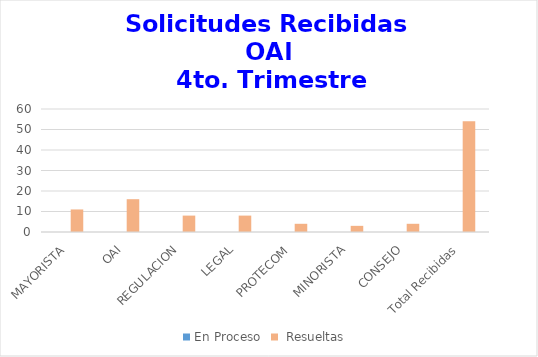
| Category | En Proceso |  Resueltas  |
|---|---|---|
| MAYORISTA | 0 | 11 |
| OAI | 0 | 16 |
| REGULACION | 0 | 8 |
| LEGAL | 0 | 8 |
| PROTECOM | 0 | 4 |
| MINORISTA | 0 | 3 |
| CONSEJO | 0 | 4 |
| Total Recibidas | 0 | 54 |